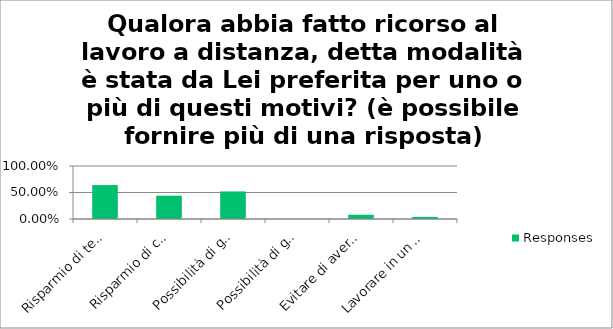
| Category | Responses |
|---|---|
| Risparmio di tempo per recarsi presso il luogo di lavoro | 0.64 |
| Risparmio di costi per le trasferte | 0.44 |
| Possibilità di gestire meglio l’accudimento di figli o altre persone | 0.52 |
| Possibilità di gestire meglio il mio handicap/disabilità | 0 |
| Evitare di avere un contatto diretto con persone o situazioni a me sgradite nel mio contesto lavorativo | 0.08 |
| Lavorare in un luogo che mi piacesse di più rispetto al mio abituale luogo di lavoro | 0.04 |